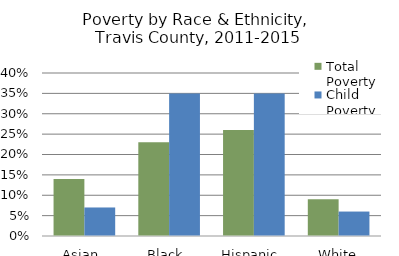
| Category | Total Poverty | Child Poverty |
|---|---|---|
| Asian  | 0.14 | 0.07 |
| Black  | 0.23 | 0.35 |
| Hispanic  | 0.26 | 0.35 |
| White | 0.09 | 0.06 |